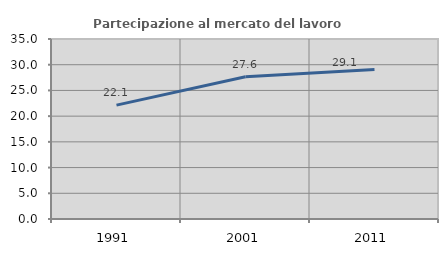
| Category | Partecipazione al mercato del lavoro  femminile |
|---|---|
| 1991.0 | 22.137 |
| 2001.0 | 27.642 |
| 2011.0 | 29.06 |